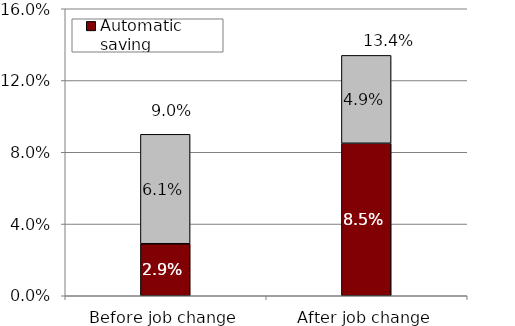
| Category | Automatic saving | Other saving |
|---|---|---|
| Before job change | 0.029 | 0.061 |
| After job change | 0.085 | 0.049 |